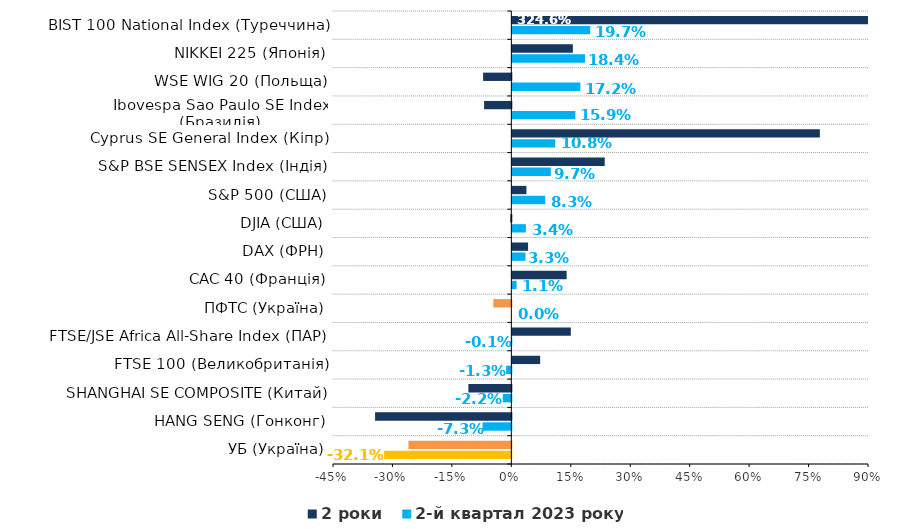
| Category | 2-й квартал 2023 року | 2 роки |
|---|---|---|
| УБ (Україна) | -0.321 | -0.26 |
| HANG SENG (Гонконг) | -0.073 | -0.344 |
| SHANGHAI SE COMPOSITE (Китай) | -0.022 | -0.108 |
| FTSE 100 (Великобританія) | -0.013 | 0.07 |
| FTSE/JSE Africa All-Share Index (ПАР) | -0.001 | 0.148 |
| ПФТС (Україна) | 0 | -0.045 |
| CAC 40 (Франція) | 0.011 | 0.137 |
| DAX (ФРН) | 0.033 | 0.04 |
| DJIA (США) | 0.034 | -0.003 |
| S&P 500 (США) | 0.083 | 0.036 |
| S&P BSE SENSEX Index (Індія) | 0.097 | 0.233 |
| Cyprus SE General Index (Кіпр) | 0.108 | 0.776 |
| Ibovespa Sao Paulo SE Index (Бразилія) | 0.159 | -0.069 |
| WSE WIG 20 (Польща) | 0.172 | -0.071 |
| NIKKEI 225 (Японія) | 0.184 | 0.153 |
| BIST 100 National Index (Туреччина) | 0.197 | 3.246 |